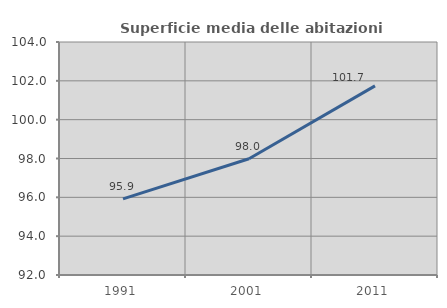
| Category | Superficie media delle abitazioni occupate |
|---|---|
| 1991.0 | 95.918 |
| 2001.0 | 97.985 |
| 2011.0 | 101.741 |